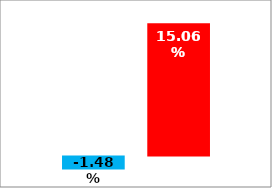
| Category | Dem | Rep |
|---|---|---|
| 0 | -0.015 | 0.151 |